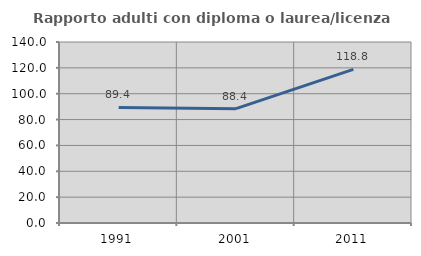
| Category | Rapporto adulti con diploma o laurea/licenza media  |
|---|---|
| 1991.0 | 89.394 |
| 2001.0 | 88.421 |
| 2011.0 | 118.812 |